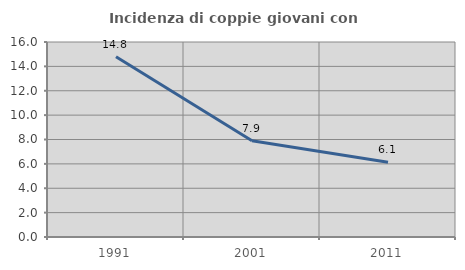
| Category | Incidenza di coppie giovani con figli |
|---|---|
| 1991.0 | 14.791 |
| 2001.0 | 7.902 |
| 2011.0 | 6.13 |